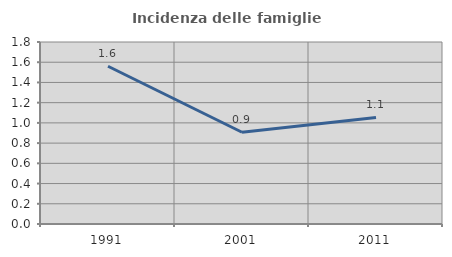
| Category | Incidenza delle famiglie numerose |
|---|---|
| 1991.0 | 1.56 |
| 2001.0 | 0.907 |
| 2011.0 | 1.054 |